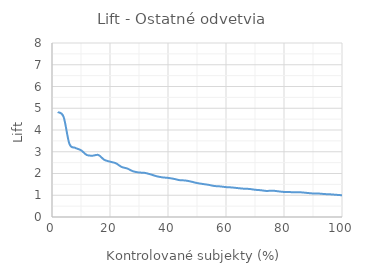
| Category | Ostatné odvetvia |
|---|---|
| 2.0 | 4.825 |
| 4.0 | 4.605 |
| 6.0 | 3.363 |
| 8.0 | 3.18 |
| 10.0 | 3.07 |
| 12.0 | 2.851 |
| 14.0 | 2.82 |
| 16.0 | 2.851 |
| 18.0 | 2.632 |
| 20.0 | 2.544 |
| 22.0 | 2.472 |
| 24.0 | 2.303 |
| 26.0 | 2.227 |
| 28.0 | 2.099 |
| 30.0 | 2.047 |
| 32.0 | 2.029 |
| 34.0 | 1.961 |
| 36.0 | 1.876 |
| 38.0 | 1.824 |
| 40.0 | 1.798 |
| 42.0 | 1.754 |
| 44.0 | 1.695 |
| 46.0 | 1.678 |
| 48.0 | 1.626 |
| 50.0 | 1.561 |
| 52.0 | 1.518 |
| 54.0 | 1.478 |
| 56.0 | 1.425 |
| 58.0 | 1.407 |
| 60.0 | 1.374 |
| 62.0 | 1.358 |
| 64.0 | 1.329 |
| 66.0 | 1.302 |
| 68.0 | 1.29 |
| 70.0 | 1.253 |
| 72.0 | 1.231 |
| 74.0 | 1.197 |
| 76.0 | 1.212 |
| 78.0 | 1.181 |
| 80.0 | 1.151 |
| 82.0 | 1.145 |
| 84.0 | 1.138 |
| 86.0 | 1.132 |
| 88.0 | 1.106 |
| 90.0 | 1.082 |
| 92.0 | 1.077 |
| 94.0 | 1.054 |
| 96.0 | 1.042 |
| 98.0 | 1.02 |
| 100.0 | 1 |